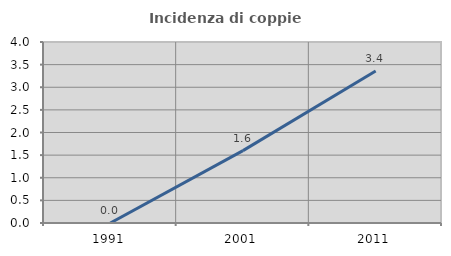
| Category | Incidenza di coppie miste |
|---|---|
| 1991.0 | 0 |
| 2001.0 | 1.6 |
| 2011.0 | 3.358 |